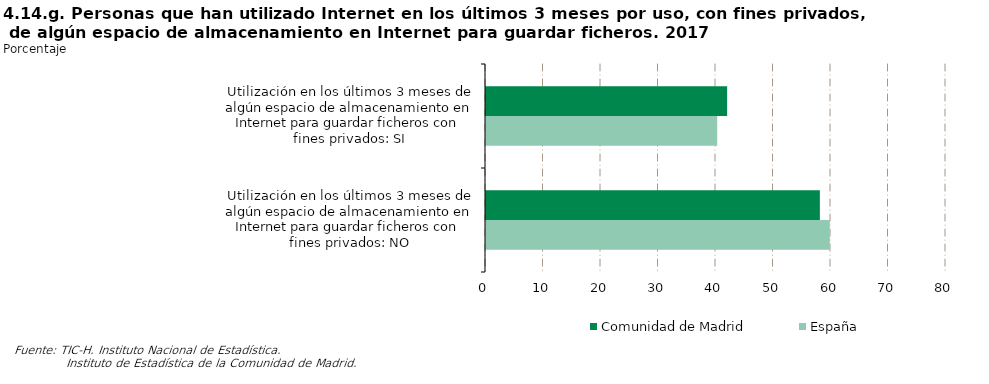
| Category | Comunidad de Madrid | España |
|---|---|---|
| Utilización en los últimos 3 meses de algún espacio de almacenamiento en Internet para guardar ficheros con fines privados: SI | 41.935 | 40.209 |
| Utilización en los últimos 3 meses de algún espacio de almacenamiento en Internet para guardar ficheros con fines privados: NO | 58.065 | 59.791 |